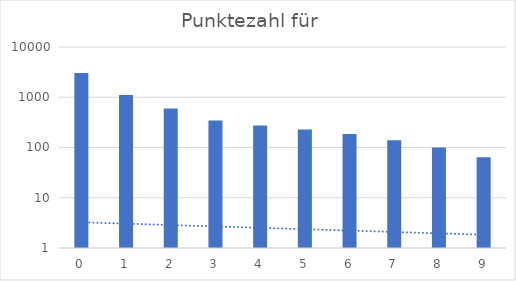
| Category | Series 0 |
|---|---|
| 0.0 | 3047.25 |
| 1.0 | 1108.28 |
| 2.0 | 597.204 |
| 3.0 | 345.659 |
| 4.0 | 274.426 |
| 5.0 | 226.89 |
| 6.0 | 186.25 |
| 7.0 | 139.495 |
| 8.0 | 100.175 |
| 9.0 | 64.03 |